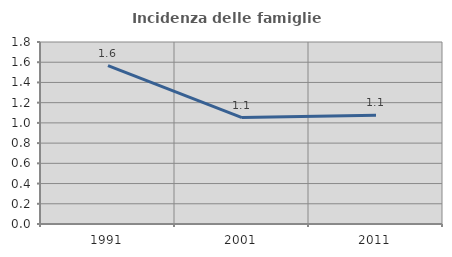
| Category | Incidenza delle famiglie numerose |
|---|---|
| 1991.0 | 1.567 |
| 2001.0 | 1.053 |
| 2011.0 | 1.076 |